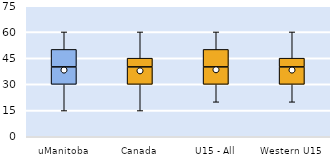
| Category | 25th | 50th | 75th |
|---|---|---|---|
| uManitoba | 30 | 10 | 10 |
| Canada | 30 | 10 | 5 |
| U15 - All | 30 | 10 | 10 |
| Western U15 | 30 | 10 | 5 |